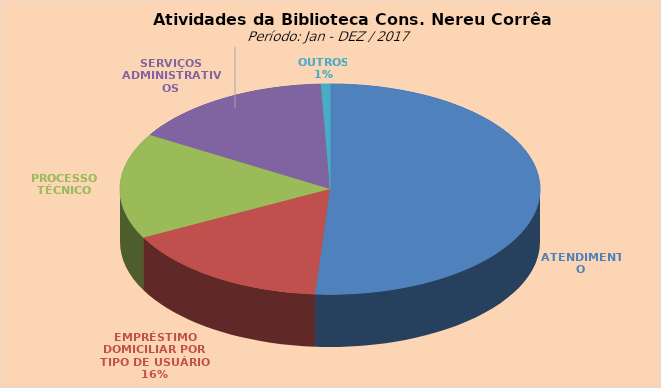
| Category | Series 0 |
|---|---|
| ATENDIMENTO | 13474 |
| EMPRÉSTIMO DOMICILIAR POR TIPO DE USUÁRIO | 4285 |
| PROCESSO TÉCNICO | 4283 |
| SERVIÇOS ADMINISTRATIVOS | 4132 |
| OUTROS | 184 |